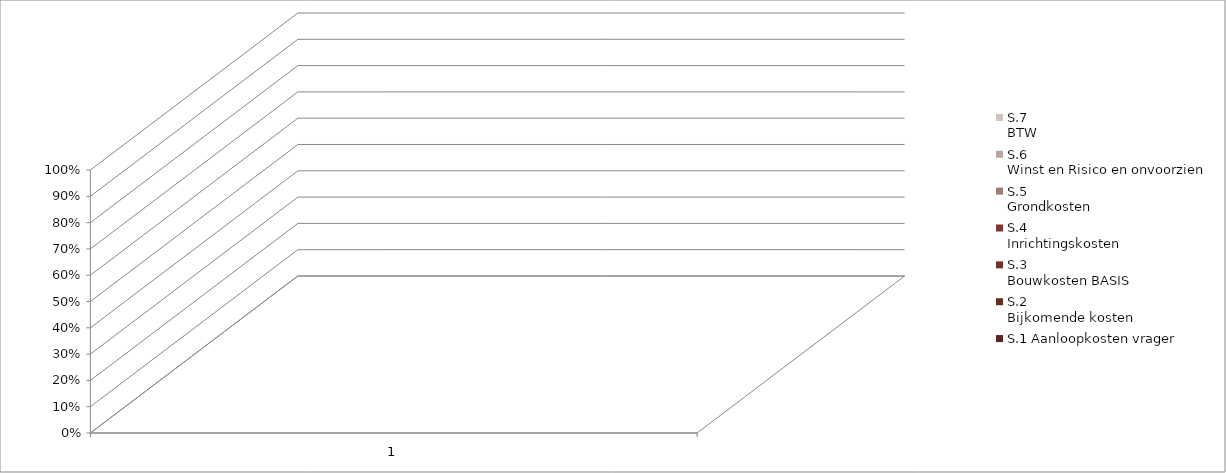
| Category | S.1 Aanloopkosten vrager | S.2 
Bijkomende kosten | S.3
Bouwkosten BASIS | S.4
Inrichtingskosten | S.5 
Grondkosten | S.6  
Winst en Risico en onvoorzien | S.7 
BTW |
|---|---|---|---|---|---|---|---|
| 0 | 0 | 0 | 0 | 0 | 0 | 0 | 0 |